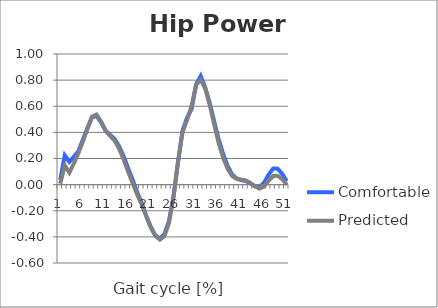
| Category | Comfortable | Predicted |
|---|---|---|
| 0 | 0.037 | 0.007 |
| 1 | 0.224 | 0.147 |
| 2 | 0.175 | 0.092 |
| 3 | 0.213 | 0.162 |
| 4 | 0.256 | 0.24 |
| 5 | 0.345 | 0.331 |
| 6 | 0.434 | 0.428 |
| 7 | 0.514 | 0.521 |
| 8 | 0.526 | 0.537 |
| 9 | 0.478 | 0.483 |
| 10 | 0.415 | 0.412 |
| 11 | 0.382 | 0.373 |
| 12 | 0.349 | 0.336 |
| 13 | 0.293 | 0.275 |
| 14 | 0.215 | 0.191 |
| 15 | 0.123 | 0.098 |
| 16 | 0.035 | 0.009 |
| 17 | -0.061 | -0.078 |
| 18 | -0.141 | -0.154 |
| 19 | -0.24 | -0.243 |
| 20 | -0.325 | -0.329 |
| 21 | -0.389 | -0.393 |
| 22 | -0.413 | -0.421 |
| 23 | -0.378 | -0.394 |
| 24 | -0.278 | -0.293 |
| 25 | -0.09 | -0.097 |
| 26 | 0.173 | 0.176 |
| 27 | 0.414 | 0.403 |
| 28 | 0.512 | 0.494 |
| 29 | 0.579 | 0.603 |
| 30 | 0.768 | 0.765 |
| 31 | 0.831 | 0.802 |
| 32 | 0.743 | 0.736 |
| 33 | 0.624 | 0.61 |
| 34 | 0.482 | 0.459 |
| 35 | 0.342 | 0.314 |
| 36 | 0.23 | 0.201 |
| 37 | 0.139 | 0.117 |
| 38 | 0.075 | 0.064 |
| 39 | 0.047 | 0.044 |
| 40 | 0.034 | 0.038 |
| 41 | 0.027 | 0.032 |
| 42 | 0.008 | 0.012 |
| 43 | -0.012 | -0.014 |
| 44 | -0.016 | -0.03 |
| 45 | 0.014 | -0.014 |
| 46 | 0.076 | 0.029 |
| 47 | 0.124 | 0.066 |
| 48 | 0.122 | 0.068 |
| 49 | 0.083 | 0.043 |
| 50 | 0.027 | -0.001 |